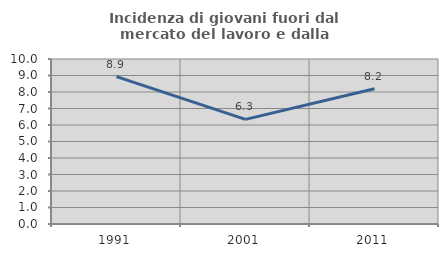
| Category | Incidenza di giovani fuori dal mercato del lavoro e dalla formazione  |
|---|---|
| 1991.0 | 8.93 |
| 2001.0 | 6.342 |
| 2011.0 | 8.199 |